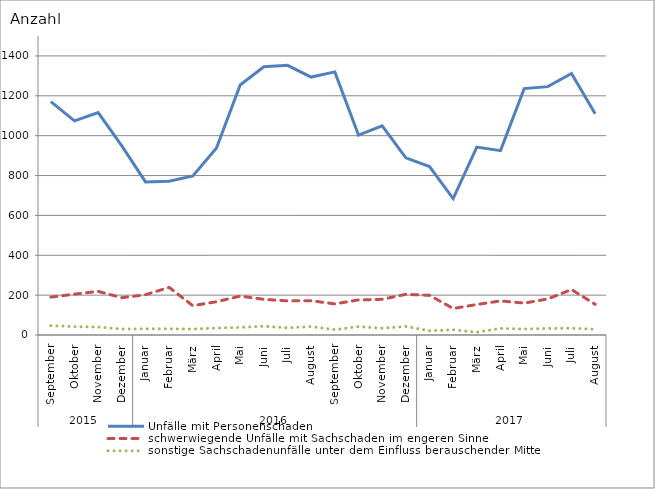
| Category | Unfälle mit Personenschaden | schwerwiegende Unfälle mit Sachschaden im engeren Sinne | sonstige Sachschadenunfälle unter dem Einfluss berauschender Mittel |
|---|---|---|---|
| 0 | 1171 | 190 | 47 |
| 1 | 1074 | 205 | 42 |
| 2 | 1116 | 219 | 40 |
| 3 | 949 | 187 | 30 |
| 4 | 768 | 202 | 31 |
| 5 | 771 | 239 | 31 |
| 6 | 798 | 147 | 30 |
| 7 | 938 | 167 | 35 |
| 8 | 1254 | 195 | 38 |
| 9 | 1346 | 179 | 44 |
| 10 | 1353 | 171 | 36 |
| 11 | 1294 | 172 | 42 |
| 12 | 1320 | 156 | 27 |
| 13 | 1003 | 176 | 42 |
| 14 | 1049 | 179 | 34 |
| 15 | 889 | 204 | 43 |
| 16 | 845 | 199 | 21 |
| 17 | 684 | 133 | 26 |
| 18 | 943 | 153 | 14 |
| 19 | 925 | 171 | 33 |
| 20 | 1236 | 160 | 30 |
| 21 | 1246 | 181 | 33 |
| 22 | 1312 | 228 | 34 |
| 23 | 1110 | 154 | 29 |